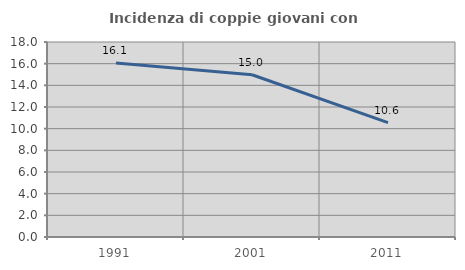
| Category | Incidenza di coppie giovani con figli |
|---|---|
| 1991.0 | 16.061 |
| 2001.0 | 14.975 |
| 2011.0 | 10.562 |